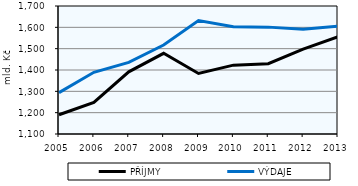
| Category | PŘÍJMY | VÝDAJE |
|---|---|---|
| 2005.0 | 1190.074 | 1293.929 |
| 2006.0 | 1248.492 | 1389.107 |
| 2007.0 | 1391.492 | 1435.809 |
| 2008.0 | 1478.233 | 1517.34 |
| 2009.0 | 1383.944 | 1631.493 |
| 2010.0 | 1422.802 | 1602.321 |
| 2011.0 | 1429.589 | 1600.976 |
| 2012.0 | 1498.294 | 1591.179 |
| 2013.0 | 1556.133 | 1605.871 |